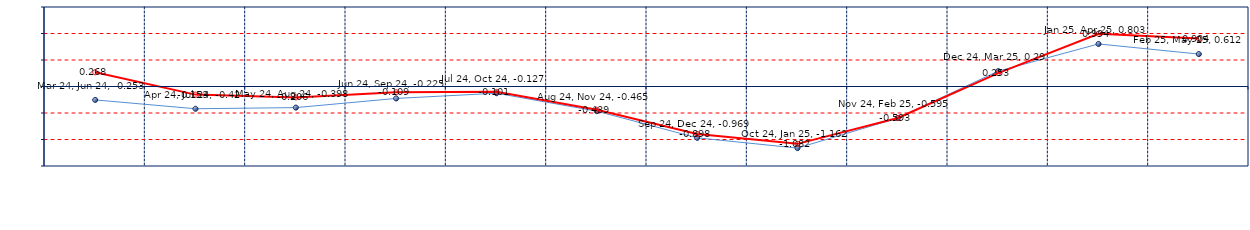
| Category | Last | Historical |
|---|---|---|
| Mar 24, Jun 24 | -0.253 | 0.268 |
| Apr 24, Jul 24 | -0.42 | -0.153 |
| May 24, Aug 24 | -0.398 | -0.206 |
| Jun 24, Sep 24 | -0.225 | -0.109 |
| Jul 24, Oct 24 | -0.127 | -0.101 |
| Aug 24, Nov 24 | -0.465 | -0.439 |
| Sep 24, Dec 24 | -0.969 | -0.898 |
| Oct 24, Jan 25 | -1.162 | -1.082 |
| Nov 24, Feb 25 | -0.595 | -0.593 |
| Dec 24, Mar 25 | 0.29 | 0.253 |
| Jan 25, Apr 25 | 0.803 | 0.994 |
| Feb 25, May 25 | 0.612 | 0.904 |